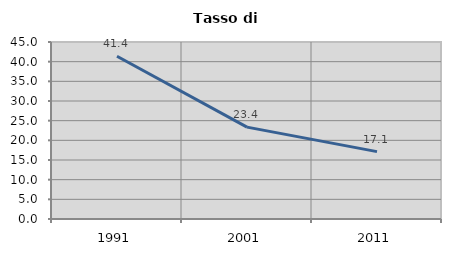
| Category | Tasso di disoccupazione   |
|---|---|
| 1991.0 | 41.379 |
| 2001.0 | 23.364 |
| 2011.0 | 17.125 |